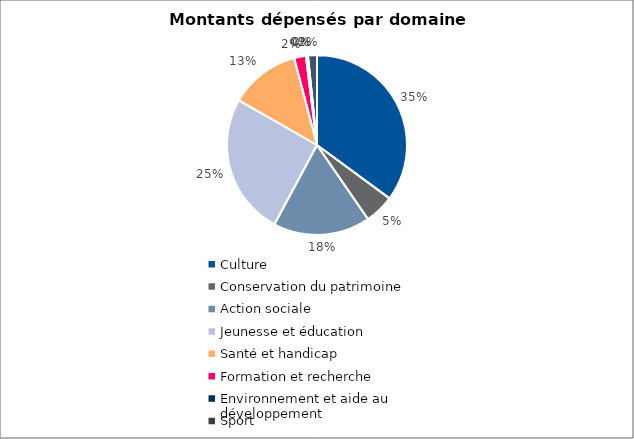
| Category | Series 0 |
|---|---|
| Culture | 9508060 |
| Conservation du patrimoine | 1439000 |
| Action sociale | 4723200 |
| Jeunesse et éducation | 6882400 |
| Santé et handicap | 3433000 |
| Formation et recherche | 570000 |
| Environnement et aide au
développement | 96500 |
| Sport | 0 |
| Autres projets d’utilité publique | 440000 |